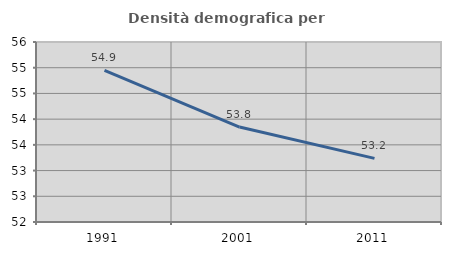
| Category | Densità demografica |
|---|---|
| 1991.0 | 54.948 |
| 2001.0 | 53.846 |
| 2011.0 | 53.238 |